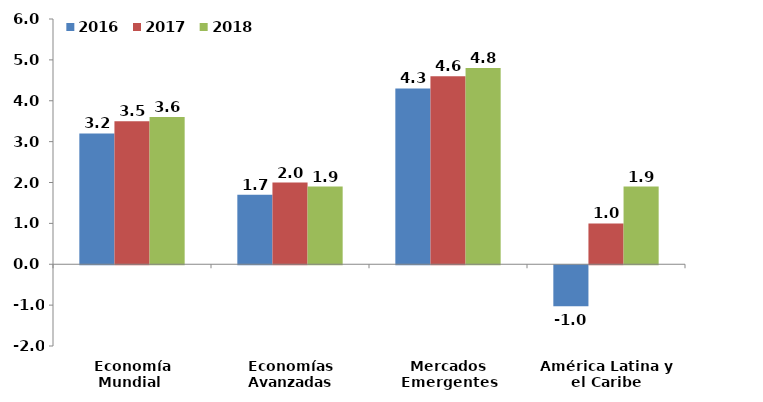
| Category | 2016 | 2017 | 2018 |
|---|---|---|---|
| Economía Mundial  | 3.2 | 3.5 | 3.6 |
| Economías Avanzadas | 1.7 | 2 | 1.9 |
| Mercados Emergentes | 4.3 | 4.6 | 4.8 |
| América Latina y el Caribe | -1 | 1 | 1.9 |